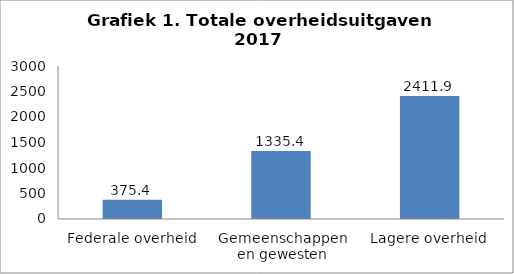
| Category | Series 0 |
|---|---|
| Federale overheid | 375.4 |
| Gemeenschappen en gewesten | 1335.4 |
| Lagere overheid | 2411.9 |